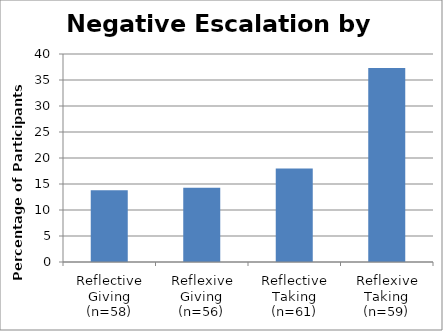
| Category | Series 0 |
|---|---|
| _x0018_Reflective Giving (n=58) | 13.8 |
| _x0017_Reflexive Giving (n=56) | 14.3 |
| _x0018_Reflective Taking (n=61) | 18 |
| _x0017_Reflexive Taking (n=59) | 37.3 |